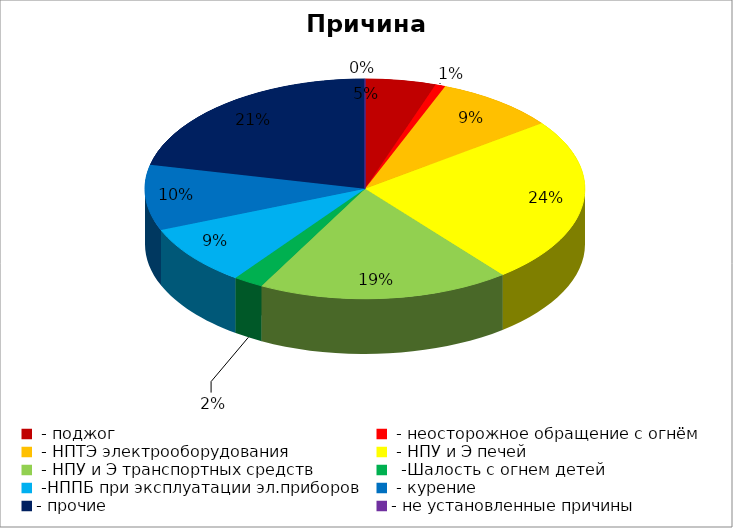
| Category | Причина пожара |
|---|---|
|  - поджог | 7 |
|  - неосторожное обращение с огнём | 1 |
|  - НПТЭ электрооборудования | 12 |
|  - НПУ и Э печей | 33 |
|  - НПУ и Э транспортных средств | 25 |
|   -Шалость с огнем детей | 3 |
|  -НППБ при эксплуатации эл.приборов | 12 |
|  - курение | 13 |
| - прочие | 29 |
| - не установленные причины | 0 |